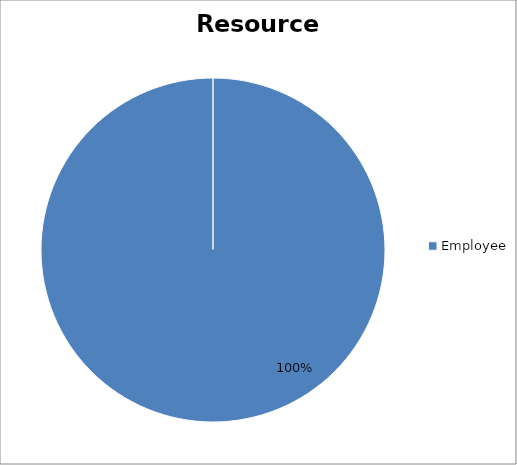
| Category | data |
|---|---|
| Employee | 233250 |